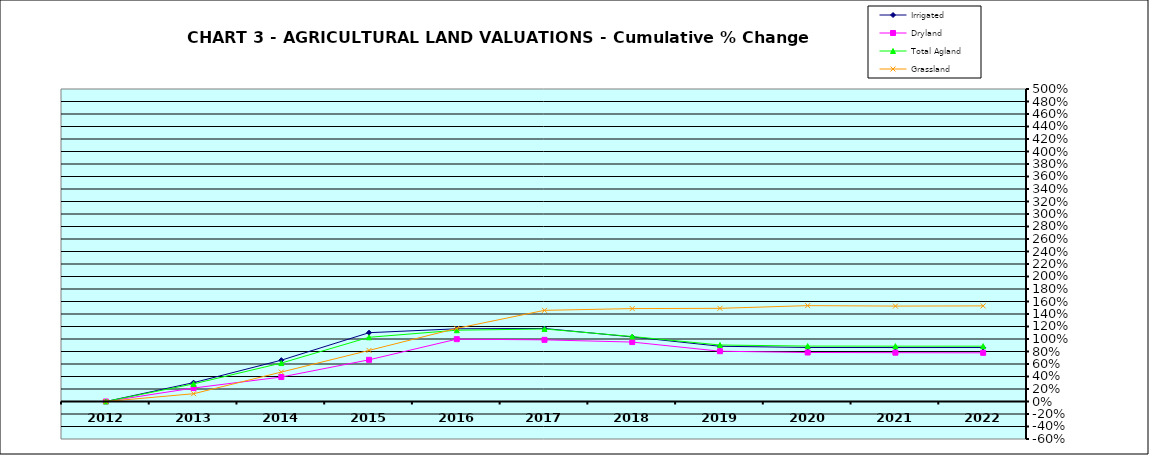
| Category | Irrigated | Dryland | Total Agland | Grassland |
|---|---|---|---|---|
| 2012.0 | 0 | 0 | 0 | 0 |
| 2013.0 | 0.302 | 0.216 | 0.282 | 0.124 |
| 2014.0 | 0.661 | 0.392 | 0.615 | 0.471 |
| 2015.0 | 1.101 | 0.667 | 1.027 | 0.818 |
| 2016.0 | 1.163 | 0.997 | 1.141 | 1.17 |
| 2017.0 | 1.168 | 0.986 | 1.161 | 1.459 |
| 2018.0 | 1.033 | 0.951 | 1.04 | 1.487 |
| 2019.0 | 0.884 | 0.805 | 0.904 | 1.491 |
| 2020.0 | 0.864 | 0.784 | 0.887 | 1.534 |
| 2021.0 | 0.863 | 0.781 | 0.885 | 1.527 |
| 2022.0 | 0.864 | 0.779 | 0.885 | 1.53 |